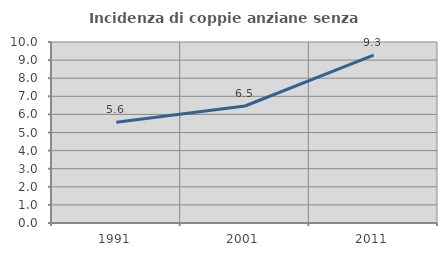
| Category | Incidenza di coppie anziane senza figli  |
|---|---|
| 1991.0 | 5.571 |
| 2001.0 | 6.463 |
| 2011.0 | 9.274 |